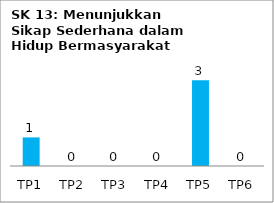
| Category | Bil Pel |
|---|---|
| TP1 | 1 |
| TP2 | 0 |
| TP3 | 0 |
| TP4 | 0 |
| TP5 | 3 |
| TP6 | 0 |